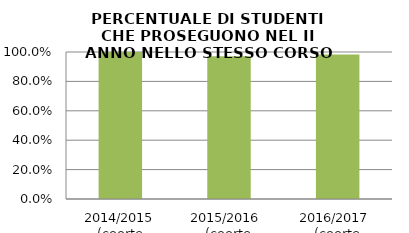
| Category | 2014/2015 (coorte 2013/14) 2015/2016  (coorte 2014/15) 2016/2017  (coorte 2015/16) |
|---|---|
| 2014/2015 (coorte 2013/14) | 1 |
| 2015/2016  (coorte 2014/15) | 0.971 |
| 2016/2017  (coorte 2015/16) | 0.983 |